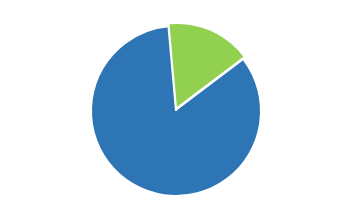
| Category | Series 0 |
|---|---|
| 0 | 0.839 |
| 1 | 0.161 |